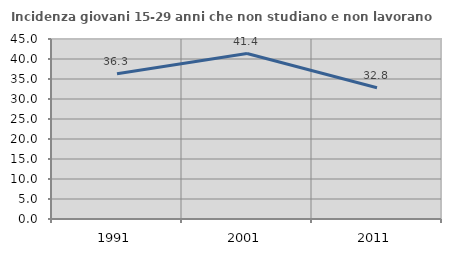
| Category | Incidenza giovani 15-29 anni che non studiano e non lavorano  |
|---|---|
| 1991.0 | 36.316 |
| 2001.0 | 41.368 |
| 2011.0 | 32.802 |